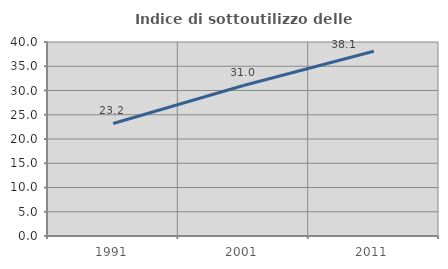
| Category | Indice di sottoutilizzo delle abitazioni  |
|---|---|
| 1991.0 | 23.206 |
| 2001.0 | 31.034 |
| 2011.0 | 38.088 |